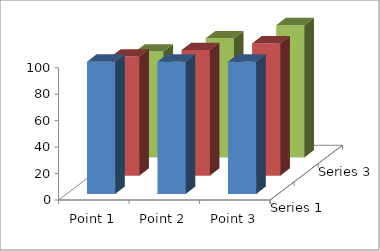
| Category | Series 1 | Series 2 | Series 3 |
|---|---|---|---|
| Point 1 | 100 | 90 | 80 |
| Point 2 | 100 | 95 | 90 |
| Point 3 | 100 | 100 | 100 |